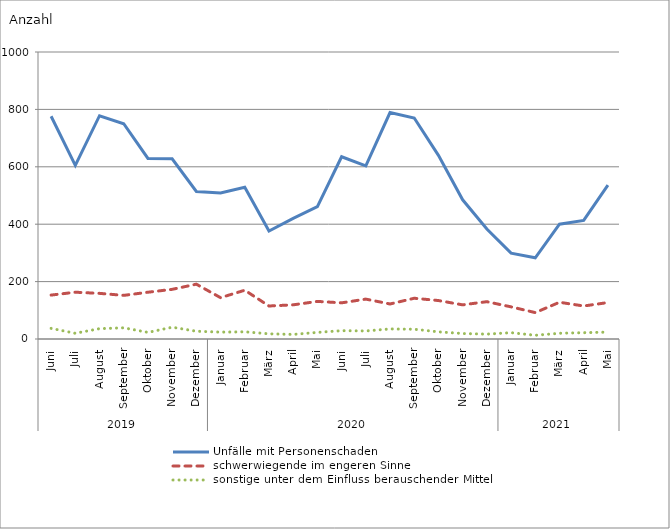
| Category | Unfälle mit Personenschaden | schwerwiegende im engeren Sinne | sonstige unter dem Einfluss berauschender Mittel |
|---|---|---|---|
| 0 | 776 | 153 | 37 |
| 1 | 605 | 163 | 20 |
| 2 | 778 | 159 | 36 |
| 3 | 750 | 152 | 39 |
| 4 | 629 | 163 | 23 |
| 5 | 628 | 173 | 41 |
| 6 | 514 | 191 | 27 |
| 7 | 509 | 144 | 24 |
| 8 | 529 | 170 | 25 |
| 9 | 376 | 115 | 18 |
| 10 | 420 | 119 | 16 |
| 11 | 461 | 131 | 23 |
| 12 | 635 | 126 | 29 |
| 13 | 603 | 139 | 28 |
| 14 | 789 | 122 | 35 |
| 15 | 770 | 142 | 34 |
| 16 | 640 | 134 | 25 |
| 17 | 485 | 119 | 19 |
| 18 | 383 | 130 | 17 |
| 19 | 299 | 112 | 22 |
| 20 | 283 | 92 | 13 |
| 21 | 400 | 128 | 20 |
| 22 | 413 | 115 | 22 |
| 23 | 536 | 127 | 24 |